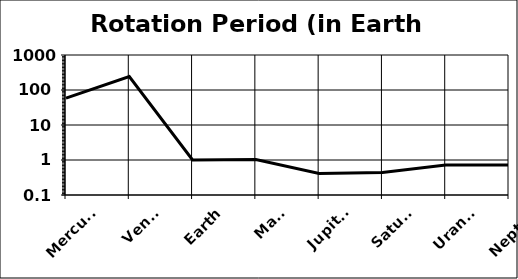
| Category | Rotation Period (in Earth days) |
|---|---|
| Mercury | 58.65 |
| Venus | 243 |
| Earth | 1 |
| Mars | 1.03 |
| Jupiter | 0.41 |
| Saturn | 0.44 |
| Uranus | 0.72 |
| Neptune | 0.72 |